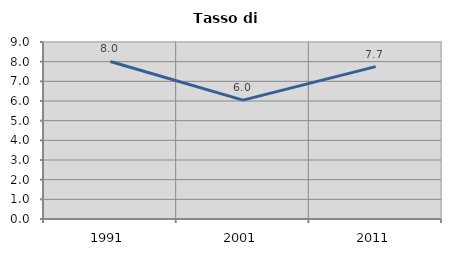
| Category | Tasso di disoccupazione   |
|---|---|
| 1991.0 | 8.009 |
| 2001.0 | 6.047 |
| 2011.0 | 7.746 |